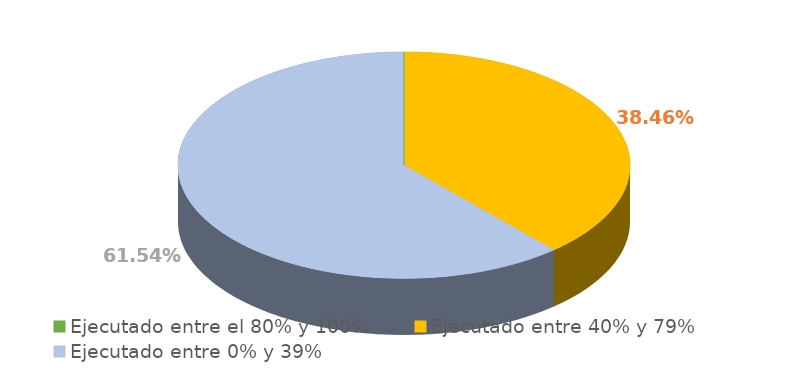
| Category | Series 0 |
|---|---|
| Ejecutado entre el 80% y 100% | 0 |
| Ejecutado entre 40% y 79% | 0.385 |
| Ejecutado entre 0% y 39% | 0.615 |